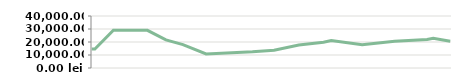
| Category | LUNĂ   |
|---|---|
| 2013-04-23 | 14600 |
| 2013-04-25 | 14600 |
| 2013-05-07 | 29000 |
| 2013-05-14 | 29000 |
| 2013-05-14 | 29000 |
| 2013-05-29 | 29000 |
| 2013-06-10 | 21600 |
| 2013-06-21 | 17950 |
| 2013-07-06 | 10776.471 |
| 2013-08-05 | 12455.862 |
| 2013-08-19 | 13667.568 |
| 2013-09-04 | 17651.667 |
| 2013-09-20 | 19877.912 |
| 2013-09-25 | 21138.05 |
| 2013-10-15 | 17951.744 |
| 2013-11-05 | 20556.13 |
| 2013-11-26 | 21997.139 |
| 2013-11-30 | 22917.635 |
| 2013-12-11 | 20504.315 |